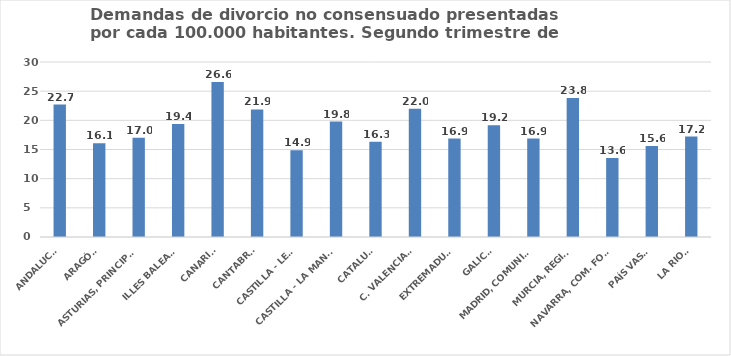
| Category | Series 0 |
|---|---|
| ANDALUCÍA | 22.697 |
| ARAGÓN | 16.071 |
| ASTURIAS, PRINCIPADO | 17.023 |
| ILLES BALEARS | 19.384 |
| CANARIAS | 26.557 |
| CANTABRIA | 21.872 |
| CASTILLA - LEÓN | 14.852 |
| CASTILLA - LA MANCHA | 19.784 |
| CATALUÑA | 16.343 |
| C. VALENCIANA | 21.981 |
| EXTREMADURA | 16.884 |
| GALICIA | 19.151 |
| MADRID, COMUNIDAD | 16.873 |
| MURCIA, REGIÓN | 23.834 |
| NAVARRA, COM. FORAL | 13.562 |
| PAÍS VASCO | 15.585 |
| LA RIOJA | 17.215 |